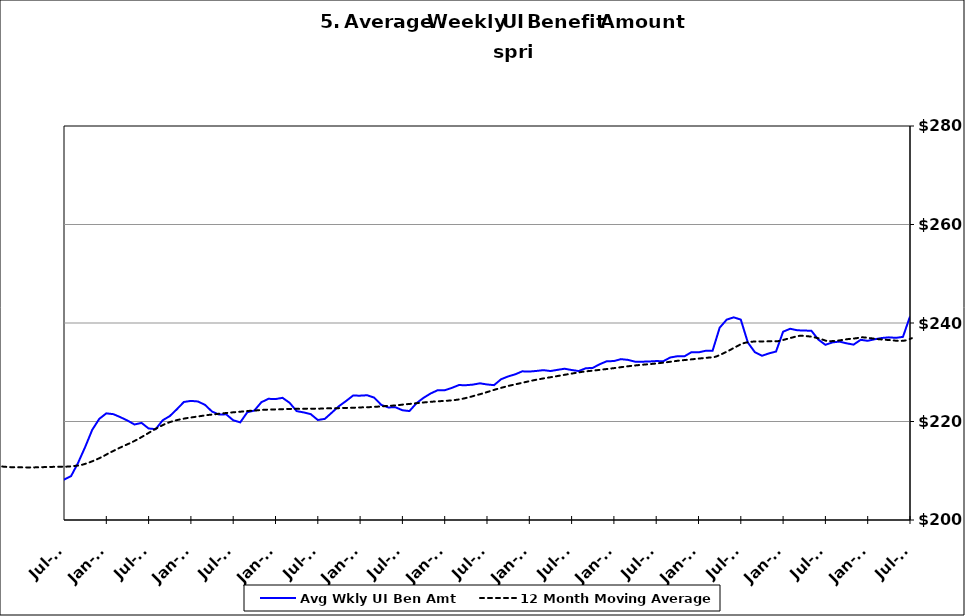
| Category | Avg Wkly UI Ben Amt |
|---|---|
| 1995-01-31 | 152.517 |
| 1995-02-28 | 151.164 |
| 1995-03-31 | 148.4 |
| 1995-04-30 | 146.034 |
| 1995-05-31 | 146.738 |
| 1995-06-30 | 147.885 |
| 1995-07-31 | 145.798 |
| 1995-08-31 | 144.052 |
| 1995-09-30 | 147.334 |
| 1995-10-31 | 151.535 |
| 1995-11-30 | 152.903 |
| 1995-12-31 | 153.258 |
| 1996-01-15 | 153.468 |
| 1996-02-15 | 153.032 |
| 1996-03-15 | 155.453 |
| 1996-04-15 | 148.614 |
| 1996-05-15 | 148.648 |
| 1996-06-15 | 150.145 |
| 1996-07-15 | 147.052 |
| 1996-08-15 | 146.042 |
| 1996-09-15 | 149.978 |
| 1996-10-15 | 151.319 |
| 1996-11-15 | 153.295 |
| 1996-12-15 | 155.775 |
| 1997-01-15 | 154.813 |
| 1997-02-15 | 151.102 |
| 1997-03-15 | 149.222 |
| 1997-04-15 | 145.178 |
| 1997-05-31 | 145.194 |
| 1997-06-30 | 146.718 |
| 1997-07-31 | 142.224 |
| 1997-08-31 | 142.382 |
| 1997-09-30 | 143.123 |
| 1997-10-31 | 146.797 |
| 1997-11-30 | 148.163 |
| 1997-12-31 | 147.967 |
| 1998-01-31 | 147.87 |
| 1998-02-28 | 147.591 |
| 1998-03-31 | 147.262 |
| 1998-04-30 | 144.746 |
| 1998-05-31 | 146.093 |
| 1998-06-30 | 147.355 |
| 1998-07-31 | 146.079 |
| 1998-08-31 | 147.387 |
| 1998-09-30 | 147.529 |
| 1998-10-31 | 152.825 |
| 1998-11-30 | 156.171 |
| 1998-12-31 | 156.424 |
| 1999-01-31 | 157.388 |
| 1999-02-28 | 157.868 |
| 1999-03-31 | 157.505 |
| 1999-04-30 | 153.987 |
| 1999-05-31 | 153.665 |
| 1999-06-30 | 153.746 |
| 1999-07-31 | 154.09 |
| 1999-08-31 | 156.162 |
| 1999-09-30 | 157.136 |
| 1999-10-31 | 162.476 |
| 1999-11-30 | 163.291 |
| 1999-12-31 | 165.621 |
| 2000-01-31 | 166.425 |
| 2000-02-29 | 165.378 |
| 2000-03-31 | 163.05 |
| 2000-04-30 | 161.908 |
| 2000-05-31 | 160.484 |
| 2000-06-30 | 160.865 |
| 2000-07-31 | 161.011 |
| 2000-08-31 | 158.845 |
| 2000-09-30 | 161.127 |
| 2000-10-31 | 163.997 |
| 2000-11-30 | 164.759 |
| 2000-12-31 | 166.66 |
| 2001-01-31 | 168.164 |
| 2001-02-28 | 169.339 |
| 2001-03-31 | 169.617 |
| 2001-04-30 | 170.349 |
| 2001-05-31 | 168.417 |
| 2001-06-30 | 169.418 |
| 2001-07-31 | 169.733 |
| 2001-08-31 | 170.578 |
| 2001-09-30 | 174.36 |
| 2001-10-31 | 176.952 |
| 2001-11-30 | 178.489 |
| 2001-12-31 | 179.805 |
| 2002-01-31 | 179.529 |
| 2002-02-28 | 179.269 |
| 2002-03-31 | 178.588 |
| 2002-04-30 | 177.594 |
| 2002-05-31 | 175.021 |
| 2002-06-30 | 175.298 |
| 2002-07-31 | 173.853 |
| 2002-08-31 | 172.776 |
| 2002-09-30 | 174.657 |
| 2002-10-31 | 175.648 |
| 2002-11-30 | 176.299 |
| 2002-12-31 | 177.239 |
| 2003-01-31 | 176.943 |
| 2003-02-28 | 176.988 |
| 2003-03-31 | 175.698 |
| 2003-04-30 | 172.857 |
| 2003-05-31 | 171.934 |
| 2003-06-30 | 171.956 |
| 2003-07-31 | 170.949 |
| 2003-08-31 | 171.311 |
| 2003-09-30 | 171.909 |
| 2003-10-31 | 172.692 |
| 2003-11-30 | 173.689 |
| 2003-12-31 | 174.176 |
| 2004-01-31 | 173.867 |
| 2004-02-29 | 173.648 |
| 2004-03-31 | 172.152 |
| 2004-04-30 | 170.705 |
| 2004-05-31 | 170.684 |
| 2004-06-30 | 170.635 |
| 2004-07-31 | 171.229 |
| 2004-08-31 | 175.375 |
| 2004-09-30 | 182.737 |
| 2004-10-31 | 187.554 |
| 2004-11-30 | 191.316 |
| 2004-12-31 | 194.602 |
| 2005-01-31 | 196.38 |
| 2005-02-28 | 196.569 |
| 2005-03-31 | 195.523 |
| 2005-04-30 | 193.655 |
| 2005-05-31 | 193.953 |
| 2005-06-30 | 192.728 |
| 2005-07-31 | 192.211 |
| 2005-08-31 | 191.133 |
| 2005-09-30 | 194.339 |
| 2005-10-31 | 196.819 |
| 2005-11-30 | 198.473 |
| 2005-12-31 | 199.545 |
| 2006-01-31 | 199.965 |
| 2006-02-28 | 200.117 |
| 2006-03-31 | 198.335 |
| 2006-04-30 | 197.258 |
| 2006-05-31 | 195.225 |
| 2006-06-30 | 195.734 |
| 2006-07-31 | 194.92 |
| 2006-08-31 | 194.282 |
| 2006-09-30 | 196.801 |
| 2006-10-31 | 199.137 |
| 2006-11-30 | 201.183 |
| 2006-12-31 | 202.121 |
| 2007-01-31 | 202.615 |
| 2007-02-28 | 202.465 |
| 2007-03-31 | 201.75 |
| 2007-04-30 | 200.344 |
| 2007-05-31 | 198.851 |
| 2007-06-30 | 198.258 |
| 2007-07-30 | 197.654 |
| 2007-08-31 | 198.405 |
| 2007-09-30 | 200.563 |
| 2007-10-31 | 201.857 |
| 2007-11-15 | 203.345 |
| 2007-12-15 09:36:00 | 219.243 |
| 2008-01-14 19:12:00 | 219.658 |
| 2008-02-14 04:48:00 | 220.121 |
| 2008-03-15 14:24:00 | 219.456 |
| 2008-04-15 | 217.672 |
| 2008-05-15 09:36:00 | 216.637 |
| 2008-06-14 19:12:00 | 216.035 |
| 2008-07-15 04:48:00 | 213.916 |
| 2008-08-14 14:24:00 | 214.008 |
| 2008-09-14 | 216.475 |
| 2008-10-14 09:36:00 | 217.836 |
| 2008-11-13 19:12:00 | 219.819 |
| 2008-12-14 04:48:00 | 221.529 |
| 2009-01-13 14:24:00 | 222.143 |
| 2009-02-13 | 222.091 |
| 2009-03-15 09:36:00 | 222.273 |
| 2009-04-14 19:12:00 | 222.011 |
| 2009-05-15 04:48:00 | 221.558 |
| 2009-06-14 14:24:00 | 220.761 |
| 2009-07-15 | 219.225 |
| 2009-08-14 09:36:00 | 218.364 |
| 2009-09-13 19:12:00 | 218.814 |
| 2009-10-14 04:48:00 | 218.744 |
| 2009-11-13 14:24:00 | 218.719 |
| 2009-12-14 | 218.779 |
| 2010-01-13 09:36:00 | 217.988 |
| 2010-02-12 19:12:00 | 217.521 |
| 2010-03-15 04:48:00 | 216.93 |
| 2010-04-14 14:24:00 | 215.638 |
| 2010-05-15 | 213.953 |
| 2010-06-14 09:36:00 | 213.326 |
| 2010-07-14 19:12:00 | 211.48 |
| 2010-08-14 04:48:00 | 210.615 |
| 2010-09-13 14:24:00 | 211.554 |
| 2010-10-14 | 211.956 |
| 2010-11-13 09:36:00 | 212.619 |
| 2010-12-13 19:12:00 | 212.979 |
| 2011-01-13 04:48:00 | 212.778 |
| 2011-02-12 14:24:00 | 212.812 |
| 2011-03-15 | 212.631 |
| 2011-04-14 09:36:00 | 211.659 |
| 2011-05-14 19:12:00 | 210.522 |
| 2011-06-14 04:48:00 | 209.652 |
| 2011-07-14 14:24:00 | 208.005 |
| 2011-08-14 | 207.451 |
| 2011-09-13 09:36:00 | 209.173 |
| 2011-10-13 19:12:00 | 209.736 |
| 2011-11-13 04:48:00 | 211.422 |
| 2011-12-13 14:24:00 | 212.679 |
| 2012-01-13 | 212.502 |
| 2012-02-12 09:36:00 | 212.715 |
| 2012-03-13 19:12:00 | 212.846 |
| 2012-04-13 04:48:00 | 212.323 |
| 2012-05-13 14:24:00 | 210.934 |
| 2012-06-13 | 210.073 |
| 2012-07-13 09:36:00 | 208.192 |
| 2012-08-12 19:12:00 | 208.902 |
| 2012-09-12 04:48:00 | 211.616 |
| 2012-10-12 14:24:00 | 214.814 |
| 2012-11-12 | 218.296 |
| 2012-12-12 09:36:00 | 220.532 |
| 2013-01-11 19:12:00 | 221.653 |
| 2013-02-11 04:48:00 | 221.49 |
| 2013-03-13 14:24:00 | 220.877 |
| 2013-04-13 | 220.198 |
| 2013-05-13 09:36:00 | 219.395 |
| 2013-06-12 19:12:00 | 219.716 |
| 2013-07-13 04:48:00 | 218.588 |
| 2013-08-12 14:24:00 | 218.444 |
| 2013-09-12 | 220.248 |
| 2013-10-12 09:36:00 | 221.094 |
| 2013-11-11 19:12:00 | 222.471 |
| 2013-12-12 04:48:00 | 223.964 |
| 2014-01-11 14:24:00 | 224.183 |
| 2014-02-11 | 224.065 |
| 2014-03-13 09:36:00 | 223.376 |
| 2014-04-12 19:12:00 | 222.017 |
| 2014-05-13 04:48:00 | 221.409 |
| 2014-06-12 14:24:00 | 221.458 |
| 2014-07-13 | 220.256 |
| 2014-08-12 09:36:00 | 219.823 |
| 2014-09-11 19:12:00 | 221.87 |
| 2014-10-12 04:48:00 | 222.223 |
| 2014-11-11 14:24:00 | 223.919 |
| 2014-12-12 | 224.606 |
| 2015-01-11 09:36:00 | 224.554 |
| 2015-02-10 19:12:00 | 224.808 |
| 2015-03-13 04:48:00 | 223.795 |
| 2015-04-12 14:24:00 | 222.11 |
| 2015-05-13 | 221.845 |
| 2015-06-12 09:36:00 | 221.492 |
| 2015-07-12 19:12:00 | 220.308 |
| 2015-08-12 04:48:00 | 220.534 |
| 2015-09-11 14:24:00 | 221.819 |
| 2015-10-12 | 223.117 |
| 2015-11-11 09:36:00 | 224.146 |
| 2015-12-11 19:12:00 | 225.264 |
| 2016-01-11 04:48:00 | 225.247 |
| 2016-02-10 14:24:00 | 225.331 |
| 2016-03-12 | 224.849 |
| 2016-04-11 09:36:00 | 223.376 |
| 2016-05-11 19:12:00 | 222.856 |
| 2016-06-11 04:48:00 | 222.895 |
| 2016-07-11 14:24:00 | 222.285 |
| 2016-08-11 | 222.119 |
| 2016-09-10 09:36:00 | 223.72 |
| 2016-10-10 19:12:00 | 224.805 |
| 2016-11-10 04:48:00 | 225.687 |
| 2016-12-10 14:24:00 | 226.349 |
| 2017-01-10 | 226.348 |
| 2017-02-09 09:36:00 | 226.816 |
| 2017-03-11 19:12:00 | 227.395 |
| 2017-04-11 04:48:00 | 227.37 |
| 2017-05-11 14:24:00 | 227.492 |
| 2017-06-11 | 227.755 |
| 2017-07-11 09:36:00 | 227.522 |
| 2017-08-10 19:12:00 | 227.382 |
| 2017-09-10 04:48:00 | 228.581 |
| 2017-10-10 14:24:00 | 229.154 |
| 2017-11-10 | 229.58 |
| 2017-12-10 09:36:00 | 230.186 |
| 2018-01-09 19:12:00 | 230.136 |
| 2018-02-09 04:48:00 | 230.265 |
| 2018-03-11 14:24:00 | 230.427 |
| 2018-04-11 | 230.25 |
| 2018-05-11 09:36:00 | 230.487 |
| 2018-06-10 19:12:00 | 230.714 |
| 2018-07-11 04:48:00 | 230.457 |
| 2018-08-10 14:24:00 | 230.244 |
| 2018-09-10 | 230.802 |
| 2018-10-10 09:36:00 | 230.887 |
| 2018-11-09 19:12:00 | 231.636 |
| 2018-12-10 04:48:00 | 232.24 |
| 2019-01-09 14:24:00 | 232.268 |
| 2019-02-09 | 232.662 |
| 2019-03-11 09:36:00 | 232.508 |
| 2019-04-10 19:12:00 | 232.152 |
| 2019-05-11 04:48:00 | 232.145 |
| 2019-06-10 14:24:00 | 232.186 |
| 2019-07-11 | 232.27 |
| 2019-08-10 09:36:00 | 232.238 |
| 2019-09-09 19:12:00 | 232.999 |
| 2019-10-10 04:48:00 | 233.25 |
| 2019-11-09 14:24:00 | 233.231 |
| 2019-12-10 | 234.074 |
| 2020-01-09 09:36:00 | 234.041 |
| 2020-02-08 19:12:00 | 234.352 |
| 2020-03-10 04:48:00 | 234.377 |
| 2020-04-09 14:24:00 | 239.041 |
| 2020-05-10 | 240.685 |
| 2020-06-09 09:36:00 | 241.153 |
| 2020-07-09 19:12:00 | 240.685 |
| 2020-08-09 04:48:00 | 236.032 |
| 2020-09-08 14:24:00 | 234.062 |
| 2020-10-09 | 233.35 |
| 2020-11-08 09:36:00 | 233.83 |
| 2020-12-08 19:12:00 | 234.208 |
| 2021-01-08 04:48:00 | 238.23 |
| 2021-02-07 14:24:00 | 238.83 |
| 2021-03-10 | 238.528 |
| 2021-04-09 09:36:00 | 238.456 |
| 2021-05-09 19:12:00 | 238.445 |
| 2021-06-09 04:48:00 | 236.633 |
| 2021-07-09 14:24:00 | 235.568 |
| 2021-08-09 | 236.063 |
| 2021-09-08 09:36:00 | 236.227 |
| 2021-10-08 19:12:00 | 235.874 |
| 2021-11-08 04:48:00 | 235.609 |
| 2021-12-08 14:24:00 | 236.585 |
| 2022-01-08 | 236.385 |
| 2022-02-07 09:36:00 | 236.701 |
| 2022-03-09 19:12:00 | 236.956 |
| 2022-04-09 04:48:00 | 237.085 |
| 2022-05-09 14:24:00 | 236.985 |
| 2022-06-09 | 237.182 |
| 2022-07-09 09:36:00 | 241.326 |